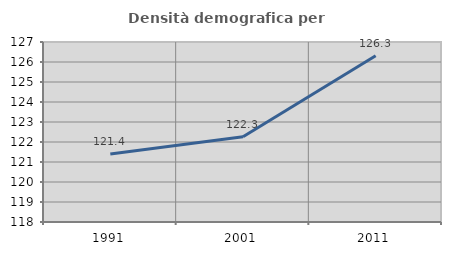
| Category | Densità demografica |
|---|---|
| 1991.0 | 121.404 |
| 2001.0 | 122.262 |
| 2011.0 | 126.314 |